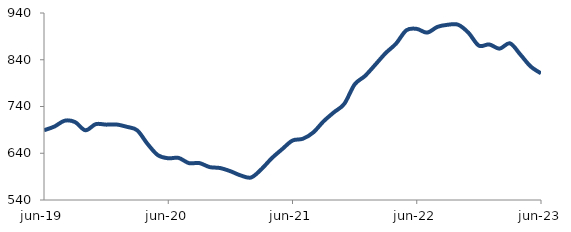
| Category | Series 0 |
|---|---|
| 2019-06-01 | 689.181 |
| 2019-07-01 | 697.076 |
| 2019-08-01 | 709.635 |
| 2019-09-01 | 706.734 |
| 2019-10-01 | 689.137 |
| 2019-11-01 | 702.277 |
| 2019-12-01 | 701.214 |
| 2020-01-01 | 701.517 |
| 2020-02-01 | 696.552 |
| 2020-03-01 | 689.099 |
| 2020-04-01 | 659.896 |
| 2020-05-01 | 635.894 |
| 2020-06-01 | 629.29 |
| 2020-07-01 | 629.994 |
| 2020-08-01 | 618.866 |
| 2020-09-01 | 619.022 |
| 2020-10-01 | 610.428 |
| 2020-11-01 | 608.402 |
| 2020-12-01 | 601.605 |
| 2021-01-01 | 592.504 |
| 2021-02-01 | 588.185 |
| 2021-03-01 | 605.989 |
| 2021-04-01 | 629.446 |
| 2021-05-01 | 648.73 |
| 2021-06-01 | 667.177 |
| 2021-07-01 | 670.996 |
| 2021-08-01 | 684.389 |
| 2021-09-01 | 708.308 |
| 2021-10-01 | 727.608 |
| 2021-11-01 | 745.65 |
| 2021-12-01 | 787.184 |
| 2022-01-01 | 805.308 |
| 2022-02-01 | 829.502 |
| 2022-03-01 | 854.336 |
| 2022-04-01 | 874.453 |
| 2022-05-01 | 903.049 |
| 2022-06-01 | 906.022 |
| 2022-07-01 | 898.071 |
| 2022-08-01 | 910.353 |
| 2022-09-01 | 914.859 |
| 2022-10-01 | 914.857 |
| 2022-11-01 | 897.607 |
| 2022-12-01 | 870.196 |
| 2023-01-01 | 872.784 |
| 2023-02-01 | 863.736 |
| 2023-03-01 | 875.118 |
| 2023-04-01 | 851.276 |
| 2023-05-01 | 825.667 |
| 2023-06-01 | 810.924 |